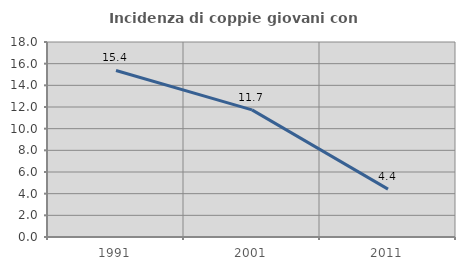
| Category | Incidenza di coppie giovani con figli |
|---|---|
| 1991.0 | 15.374 |
| 2001.0 | 11.738 |
| 2011.0 | 4.422 |